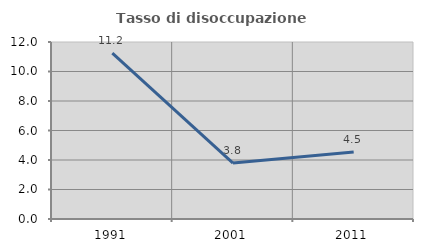
| Category | Tasso di disoccupazione giovanile  |
|---|---|
| 1991.0 | 11.24 |
| 2001.0 | 3.791 |
| 2011.0 | 4.545 |